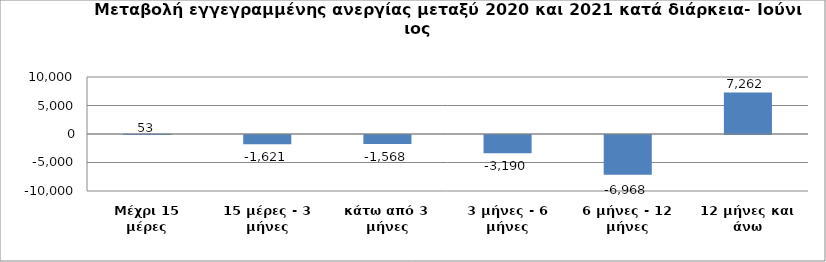
| Category | Series 0 |
|---|---|
| Μέχρι 15 μέρες | 53 |
| 15 μέρες - 3 μήνες | -1621 |
| κάτω από 3 μήνες | -1568 |
| 3 μήνες - 6 μήνες | -3190 |
| 6 μήνες - 12 μήνες | -6968 |
| 12 μήνες και άνω | 7262 |